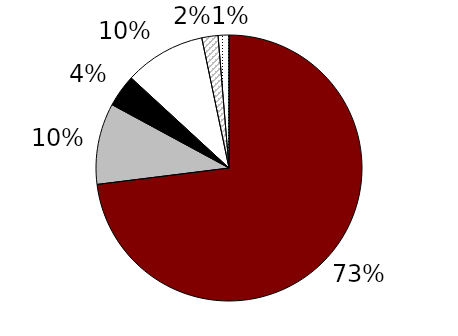
| Category | 2013 |
|---|---|
| RP-2000 | 0.73 |
| GAM 1994 | 0.099 |
| Other | 0.039 |
| Proprietary | 0.099 |
| GAM 1983 | 0.02 |
| UP-1994 | 0.013 |